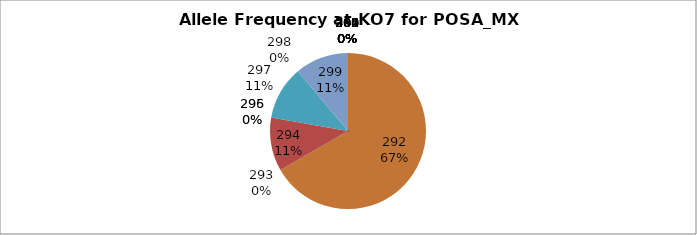
| Category | Series 0 |
|---|---|
| 260.0 | 0 |
| 285.0 | 0 |
| 289.0 | 0 |
| 290.0 | 0 |
| 291.0 | 0 |
| 292.0 | 0.667 |
| 293.0 | 0 |
| 294.0 | 0.111 |
| 295.0 | 0 |
| 296.0 | 0 |
| 297.0 | 0.111 |
| 298.0 | 0 |
| 299.0 | 0.111 |
| 300.0 | 0 |
| 301.0 | 0 |
| 302.0 | 0 |
| 304.0 | 0 |
| 305.0 | 0 |
| 306.0 | 0 |